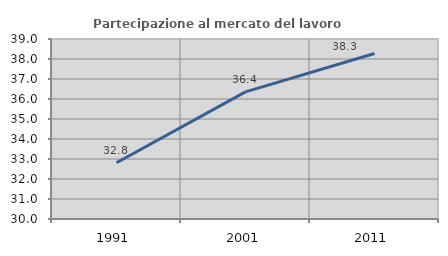
| Category | Partecipazione al mercato del lavoro  femminile |
|---|---|
| 1991.0 | 32.815 |
| 2001.0 | 36.356 |
| 2011.0 | 38.273 |